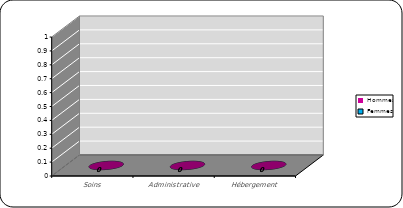
| Category | Femmes | Hommes |
|---|---|---|
| Soins | 0 | 0 |
| Administrative | 0 | 0 |
| Hébergement | 0 | 0 |